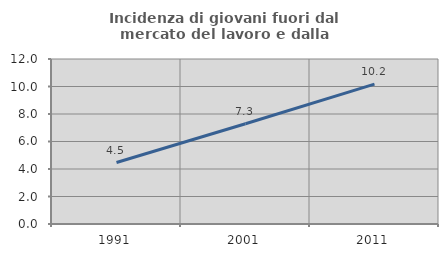
| Category | Incidenza di giovani fuori dal mercato del lavoro e dalla formazione  |
|---|---|
| 1991.0 | 4.469 |
| 2001.0 | 7.289 |
| 2011.0 | 10.172 |